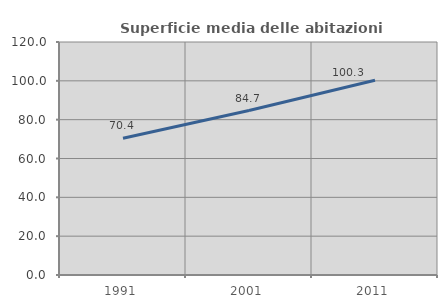
| Category | Superficie media delle abitazioni occupate |
|---|---|
| 1991.0 | 70.442 |
| 2001.0 | 84.718 |
| 2011.0 | 100.327 |